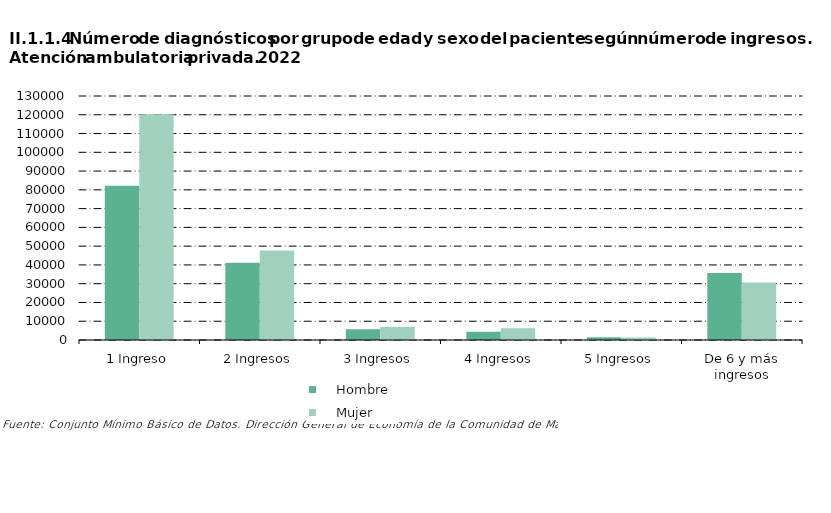
| Category |     Hombre |     Mujer |
|---|---|---|
| 1 Ingreso | 82139 | 120333 |
| 2 Ingresos | 41095 | 47630 |
| 3 Ingresos | 5771 | 6883 |
| 4 Ingresos | 4416 | 6218 |
| 5 Ingresos | 1442 | 1336 |
| De 6 y más ingresos | 35694 | 30654 |